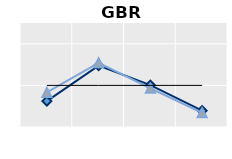
| Category | Né à l'étranger | Né dans le pays | Series 1 |
|---|---|---|---|
| 15-24 | 0.622 | 0.83 | 1 |
| 25-54 | 1.475 | 1.542 | 1 |
| 55-64 | 1.006 | 0.931 | 1 |
| 65+ | 0.392 | 0.343 | 1 |